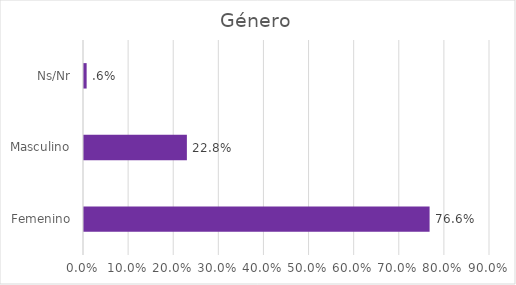
| Category | Series 0 |
|---|---|
| Femenino | 0.766 |
| Masculino | 0.228 |
| Ns/Nr | 0.006 |